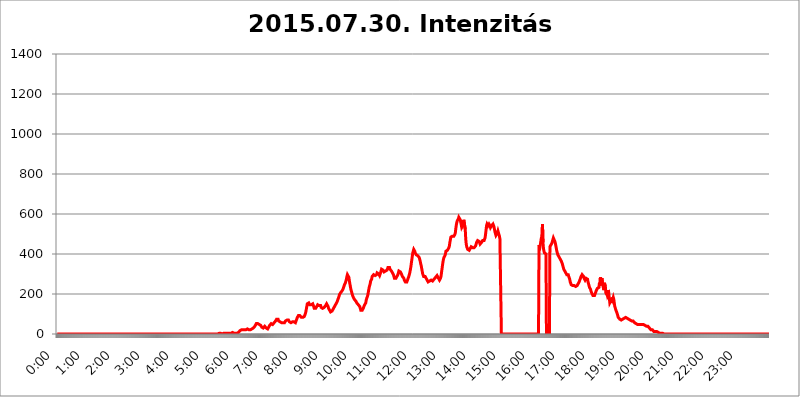
| Category | 2015.07.30. Intenzitás [W/m^2] |
|---|---|
| 0.0 | 0 |
| 0.0006944444444444445 | 0 |
| 0.001388888888888889 | 0 |
| 0.0020833333333333333 | 0 |
| 0.002777777777777778 | 0 |
| 0.003472222222222222 | 0 |
| 0.004166666666666667 | 0 |
| 0.004861111111111111 | 0 |
| 0.005555555555555556 | 0 |
| 0.0062499999999999995 | 0 |
| 0.006944444444444444 | 0 |
| 0.007638888888888889 | 0 |
| 0.008333333333333333 | 0 |
| 0.009027777777777779 | 0 |
| 0.009722222222222222 | 0 |
| 0.010416666666666666 | 0 |
| 0.011111111111111112 | 0 |
| 0.011805555555555555 | 0 |
| 0.012499999999999999 | 0 |
| 0.013194444444444444 | 0 |
| 0.013888888888888888 | 0 |
| 0.014583333333333332 | 0 |
| 0.015277777777777777 | 0 |
| 0.015972222222222224 | 0 |
| 0.016666666666666666 | 0 |
| 0.017361111111111112 | 0 |
| 0.018055555555555557 | 0 |
| 0.01875 | 0 |
| 0.019444444444444445 | 0 |
| 0.02013888888888889 | 0 |
| 0.020833333333333332 | 0 |
| 0.02152777777777778 | 0 |
| 0.022222222222222223 | 0 |
| 0.02291666666666667 | 0 |
| 0.02361111111111111 | 0 |
| 0.024305555555555556 | 0 |
| 0.024999999999999998 | 0 |
| 0.025694444444444447 | 0 |
| 0.02638888888888889 | 0 |
| 0.027083333333333334 | 0 |
| 0.027777777777777776 | 0 |
| 0.02847222222222222 | 0 |
| 0.029166666666666664 | 0 |
| 0.029861111111111113 | 0 |
| 0.030555555555555555 | 0 |
| 0.03125 | 0 |
| 0.03194444444444445 | 0 |
| 0.03263888888888889 | 0 |
| 0.03333333333333333 | 0 |
| 0.034027777777777775 | 0 |
| 0.034722222222222224 | 0 |
| 0.035416666666666666 | 0 |
| 0.036111111111111115 | 0 |
| 0.03680555555555556 | 0 |
| 0.0375 | 0 |
| 0.03819444444444444 | 0 |
| 0.03888888888888889 | 0 |
| 0.03958333333333333 | 0 |
| 0.04027777777777778 | 0 |
| 0.04097222222222222 | 0 |
| 0.041666666666666664 | 0 |
| 0.042361111111111106 | 0 |
| 0.04305555555555556 | 0 |
| 0.043750000000000004 | 0 |
| 0.044444444444444446 | 0 |
| 0.04513888888888889 | 0 |
| 0.04583333333333334 | 0 |
| 0.04652777777777778 | 0 |
| 0.04722222222222222 | 0 |
| 0.04791666666666666 | 0 |
| 0.04861111111111111 | 0 |
| 0.049305555555555554 | 0 |
| 0.049999999999999996 | 0 |
| 0.05069444444444445 | 0 |
| 0.051388888888888894 | 0 |
| 0.052083333333333336 | 0 |
| 0.05277777777777778 | 0 |
| 0.05347222222222222 | 0 |
| 0.05416666666666667 | 0 |
| 0.05486111111111111 | 0 |
| 0.05555555555555555 | 0 |
| 0.05625 | 0 |
| 0.05694444444444444 | 0 |
| 0.057638888888888885 | 0 |
| 0.05833333333333333 | 0 |
| 0.05902777777777778 | 0 |
| 0.059722222222222225 | 0 |
| 0.06041666666666667 | 0 |
| 0.061111111111111116 | 0 |
| 0.06180555555555556 | 0 |
| 0.0625 | 0 |
| 0.06319444444444444 | 0 |
| 0.06388888888888888 | 0 |
| 0.06458333333333334 | 0 |
| 0.06527777777777778 | 0 |
| 0.06597222222222222 | 0 |
| 0.06666666666666667 | 0 |
| 0.06736111111111111 | 0 |
| 0.06805555555555555 | 0 |
| 0.06874999999999999 | 0 |
| 0.06944444444444443 | 0 |
| 0.07013888888888889 | 0 |
| 0.07083333333333333 | 0 |
| 0.07152777777777779 | 0 |
| 0.07222222222222223 | 0 |
| 0.07291666666666667 | 0 |
| 0.07361111111111111 | 0 |
| 0.07430555555555556 | 0 |
| 0.075 | 0 |
| 0.07569444444444444 | 0 |
| 0.0763888888888889 | 0 |
| 0.07708333333333334 | 0 |
| 0.07777777777777778 | 0 |
| 0.07847222222222222 | 0 |
| 0.07916666666666666 | 0 |
| 0.0798611111111111 | 0 |
| 0.08055555555555556 | 0 |
| 0.08125 | 0 |
| 0.08194444444444444 | 0 |
| 0.08263888888888889 | 0 |
| 0.08333333333333333 | 0 |
| 0.08402777777777777 | 0 |
| 0.08472222222222221 | 0 |
| 0.08541666666666665 | 0 |
| 0.08611111111111112 | 0 |
| 0.08680555555555557 | 0 |
| 0.08750000000000001 | 0 |
| 0.08819444444444445 | 0 |
| 0.08888888888888889 | 0 |
| 0.08958333333333333 | 0 |
| 0.09027777777777778 | 0 |
| 0.09097222222222222 | 0 |
| 0.09166666666666667 | 0 |
| 0.09236111111111112 | 0 |
| 0.09305555555555556 | 0 |
| 0.09375 | 0 |
| 0.09444444444444444 | 0 |
| 0.09513888888888888 | 0 |
| 0.09583333333333333 | 0 |
| 0.09652777777777777 | 0 |
| 0.09722222222222222 | 0 |
| 0.09791666666666667 | 0 |
| 0.09861111111111111 | 0 |
| 0.09930555555555555 | 0 |
| 0.09999999999999999 | 0 |
| 0.10069444444444443 | 0 |
| 0.1013888888888889 | 0 |
| 0.10208333333333335 | 0 |
| 0.10277777777777779 | 0 |
| 0.10347222222222223 | 0 |
| 0.10416666666666667 | 0 |
| 0.10486111111111111 | 0 |
| 0.10555555555555556 | 0 |
| 0.10625 | 0 |
| 0.10694444444444444 | 0 |
| 0.1076388888888889 | 0 |
| 0.10833333333333334 | 0 |
| 0.10902777777777778 | 0 |
| 0.10972222222222222 | 0 |
| 0.1111111111111111 | 0 |
| 0.11180555555555556 | 0 |
| 0.11180555555555556 | 0 |
| 0.1125 | 0 |
| 0.11319444444444444 | 0 |
| 0.11388888888888889 | 0 |
| 0.11458333333333333 | 0 |
| 0.11527777777777777 | 0 |
| 0.11597222222222221 | 0 |
| 0.11666666666666665 | 0 |
| 0.1173611111111111 | 0 |
| 0.11805555555555557 | 0 |
| 0.11944444444444445 | 0 |
| 0.12013888888888889 | 0 |
| 0.12083333333333333 | 0 |
| 0.12152777777777778 | 0 |
| 0.12222222222222223 | 0 |
| 0.12291666666666667 | 0 |
| 0.12291666666666667 | 0 |
| 0.12361111111111112 | 0 |
| 0.12430555555555556 | 0 |
| 0.125 | 0 |
| 0.12569444444444444 | 0 |
| 0.12638888888888888 | 0 |
| 0.12708333333333333 | 0 |
| 0.16875 | 0 |
| 0.12847222222222224 | 0 |
| 0.12916666666666668 | 0 |
| 0.12986111111111112 | 0 |
| 0.13055555555555556 | 0 |
| 0.13125 | 0 |
| 0.13194444444444445 | 0 |
| 0.1326388888888889 | 0 |
| 0.13333333333333333 | 0 |
| 0.13402777777777777 | 0 |
| 0.13402777777777777 | 0 |
| 0.13472222222222222 | 0 |
| 0.13541666666666666 | 0 |
| 0.1361111111111111 | 0 |
| 0.13749999999999998 | 0 |
| 0.13819444444444443 | 0 |
| 0.1388888888888889 | 0 |
| 0.13958333333333334 | 0 |
| 0.14027777777777778 | 0 |
| 0.14097222222222222 | 0 |
| 0.14166666666666666 | 0 |
| 0.1423611111111111 | 0 |
| 0.14305555555555557 | 0 |
| 0.14375000000000002 | 0 |
| 0.14444444444444446 | 0 |
| 0.1451388888888889 | 0 |
| 0.1451388888888889 | 0 |
| 0.14652777777777778 | 0 |
| 0.14722222222222223 | 0 |
| 0.14791666666666667 | 0 |
| 0.1486111111111111 | 0 |
| 0.14930555555555555 | 0 |
| 0.15 | 0 |
| 0.15069444444444444 | 0 |
| 0.15138888888888888 | 0 |
| 0.15208333333333332 | 0 |
| 0.15277777777777776 | 0 |
| 0.15347222222222223 | 0 |
| 0.15416666666666667 | 0 |
| 0.15486111111111112 | 0 |
| 0.15555555555555556 | 0 |
| 0.15625 | 0 |
| 0.15694444444444444 | 0 |
| 0.15763888888888888 | 0 |
| 0.15833333333333333 | 0 |
| 0.15902777777777777 | 0 |
| 0.15972222222222224 | 0 |
| 0.16041666666666668 | 0 |
| 0.16111111111111112 | 0 |
| 0.16180555555555556 | 0 |
| 0.1625 | 0 |
| 0.16319444444444445 | 0 |
| 0.1638888888888889 | 0 |
| 0.16458333333333333 | 0 |
| 0.16527777777777777 | 0 |
| 0.16597222222222222 | 0 |
| 0.16666666666666666 | 0 |
| 0.1673611111111111 | 0 |
| 0.16805555555555554 | 0 |
| 0.16874999999999998 | 0 |
| 0.16944444444444443 | 0 |
| 0.17013888888888887 | 0 |
| 0.1708333333333333 | 0 |
| 0.17152777777777775 | 0 |
| 0.17222222222222225 | 0 |
| 0.1729166666666667 | 0 |
| 0.17361111111111113 | 0 |
| 0.17430555555555557 | 0 |
| 0.17500000000000002 | 0 |
| 0.17569444444444446 | 0 |
| 0.1763888888888889 | 0 |
| 0.17708333333333334 | 0 |
| 0.17777777777777778 | 0 |
| 0.17847222222222223 | 0 |
| 0.17916666666666667 | 0 |
| 0.1798611111111111 | 0 |
| 0.18055555555555555 | 0 |
| 0.18125 | 0 |
| 0.18194444444444444 | 0 |
| 0.1826388888888889 | 0 |
| 0.18333333333333335 | 0 |
| 0.1840277777777778 | 0 |
| 0.18472222222222223 | 0 |
| 0.18541666666666667 | 0 |
| 0.18611111111111112 | 0 |
| 0.18680555555555556 | 0 |
| 0.1875 | 0 |
| 0.18819444444444444 | 0 |
| 0.18888888888888888 | 0 |
| 0.18958333333333333 | 0 |
| 0.19027777777777777 | 0 |
| 0.1909722222222222 | 0 |
| 0.19166666666666665 | 0 |
| 0.19236111111111112 | 0 |
| 0.19305555555555554 | 0 |
| 0.19375 | 0 |
| 0.19444444444444445 | 0 |
| 0.1951388888888889 | 0 |
| 0.19583333333333333 | 0 |
| 0.19652777777777777 | 0 |
| 0.19722222222222222 | 0 |
| 0.19791666666666666 | 0 |
| 0.1986111111111111 | 0 |
| 0.19930555555555554 | 0 |
| 0.19999999999999998 | 0 |
| 0.20069444444444443 | 0 |
| 0.20138888888888887 | 0 |
| 0.2020833333333333 | 0 |
| 0.2027777777777778 | 0 |
| 0.2034722222222222 | 0 |
| 0.2041666666666667 | 0 |
| 0.20486111111111113 | 0 |
| 0.20555555555555557 | 0 |
| 0.20625000000000002 | 0 |
| 0.20694444444444446 | 0 |
| 0.2076388888888889 | 0 |
| 0.20833333333333334 | 0 |
| 0.20902777777777778 | 0 |
| 0.20972222222222223 | 0 |
| 0.21041666666666667 | 0 |
| 0.2111111111111111 | 0 |
| 0.21180555555555555 | 0 |
| 0.2125 | 0 |
| 0.21319444444444444 | 0 |
| 0.2138888888888889 | 0 |
| 0.21458333333333335 | 0 |
| 0.2152777777777778 | 0 |
| 0.21597222222222223 | 0 |
| 0.21666666666666667 | 0 |
| 0.21736111111111112 | 0 |
| 0.21805555555555556 | 0 |
| 0.21875 | 0 |
| 0.21944444444444444 | 0 |
| 0.22013888888888888 | 0 |
| 0.22083333333333333 | 0 |
| 0.22152777777777777 | 0 |
| 0.2222222222222222 | 0 |
| 0.22291666666666665 | 0 |
| 0.2236111111111111 | 0 |
| 0.22430555555555556 | 0 |
| 0.225 | 0 |
| 0.22569444444444445 | 0 |
| 0.2263888888888889 | 0 |
| 0.22708333333333333 | 3.525 |
| 0.22777777777777777 | 3.525 |
| 0.22847222222222222 | 3.525 |
| 0.22916666666666666 | 3.525 |
| 0.2298611111111111 | 3.525 |
| 0.23055555555555554 | 3.525 |
| 0.23124999999999998 | 0 |
| 0.23194444444444443 | 3.525 |
| 0.23263888888888887 | 3.525 |
| 0.2333333333333333 | 3.525 |
| 0.2340277777777778 | 3.525 |
| 0.2347222222222222 | 3.525 |
| 0.2354166666666667 | 3.525 |
| 0.23611111111111113 | 3.525 |
| 0.23680555555555557 | 3.525 |
| 0.23750000000000002 | 3.525 |
| 0.23819444444444446 | 3.525 |
| 0.2388888888888889 | 3.525 |
| 0.23958333333333334 | 3.525 |
| 0.24027777777777778 | 3.525 |
| 0.24097222222222223 | 3.525 |
| 0.24166666666666667 | 3.525 |
| 0.2423611111111111 | 3.525 |
| 0.24305555555555555 | 3.525 |
| 0.24375 | 3.525 |
| 0.24444444444444446 | 7.887 |
| 0.24513888888888888 | 7.887 |
| 0.24583333333333335 | 7.887 |
| 0.2465277777777778 | 7.887 |
| 0.24722222222222223 | 3.525 |
| 0.24791666666666667 | 3.525 |
| 0.24861111111111112 | 3.525 |
| 0.24930555555555556 | 3.525 |
| 0.25 | 3.525 |
| 0.25069444444444444 | 3.525 |
| 0.2513888888888889 | 3.525 |
| 0.2520833333333333 | 3.525 |
| 0.25277777777777777 | 3.525 |
| 0.2534722222222222 | 7.887 |
| 0.25416666666666665 | 7.887 |
| 0.2548611111111111 | 12.257 |
| 0.2555555555555556 | 12.257 |
| 0.25625000000000003 | 16.636 |
| 0.2569444444444445 | 16.636 |
| 0.2576388888888889 | 21.024 |
| 0.25833333333333336 | 21.024 |
| 0.2590277777777778 | 21.024 |
| 0.25972222222222224 | 21.024 |
| 0.2604166666666667 | 21.024 |
| 0.2611111111111111 | 21.024 |
| 0.26180555555555557 | 21.024 |
| 0.2625 | 21.024 |
| 0.26319444444444445 | 21.024 |
| 0.2638888888888889 | 21.024 |
| 0.26458333333333334 | 21.024 |
| 0.2652777777777778 | 21.024 |
| 0.2659722222222222 | 25.419 |
| 0.26666666666666666 | 25.419 |
| 0.2673611111111111 | 25.419 |
| 0.26805555555555555 | 25.419 |
| 0.26875 | 21.024 |
| 0.26944444444444443 | 21.024 |
| 0.2701388888888889 | 21.024 |
| 0.2708333333333333 | 21.024 |
| 0.27152777777777776 | 25.419 |
| 0.2722222222222222 | 25.419 |
| 0.27291666666666664 | 25.419 |
| 0.2736111111111111 | 29.823 |
| 0.2743055555555555 | 29.823 |
| 0.27499999999999997 | 29.823 |
| 0.27569444444444446 | 34.234 |
| 0.27638888888888885 | 34.234 |
| 0.27708333333333335 | 38.653 |
| 0.2777777777777778 | 43.079 |
| 0.27847222222222223 | 43.079 |
| 0.2791666666666667 | 51.951 |
| 0.2798611111111111 | 56.398 |
| 0.28055555555555556 | 56.398 |
| 0.28125 | 51.951 |
| 0.28194444444444444 | 51.951 |
| 0.2826388888888889 | 47.511 |
| 0.2833333333333333 | 47.511 |
| 0.28402777777777777 | 47.511 |
| 0.2847222222222222 | 43.079 |
| 0.28541666666666665 | 43.079 |
| 0.28611111111111115 | 38.653 |
| 0.28680555555555554 | 34.234 |
| 0.28750000000000003 | 29.823 |
| 0.2881944444444445 | 29.823 |
| 0.2888888888888889 | 29.823 |
| 0.28958333333333336 | 34.234 |
| 0.2902777777777778 | 34.234 |
| 0.29097222222222224 | 38.653 |
| 0.2916666666666667 | 34.234 |
| 0.2923611111111111 | 34.234 |
| 0.29305555555555557 | 29.823 |
| 0.29375 | 29.823 |
| 0.29444444444444445 | 25.419 |
| 0.2951388888888889 | 25.419 |
| 0.29583333333333334 | 29.823 |
| 0.2965277777777778 | 34.234 |
| 0.2972222222222222 | 38.653 |
| 0.29791666666666666 | 43.079 |
| 0.2986111111111111 | 47.511 |
| 0.29930555555555555 | 47.511 |
| 0.3 | 51.951 |
| 0.30069444444444443 | 47.511 |
| 0.3013888888888889 | 47.511 |
| 0.3020833333333333 | 47.511 |
| 0.30277777777777776 | 47.511 |
| 0.3034722222222222 | 47.511 |
| 0.30416666666666664 | 56.398 |
| 0.3048611111111111 | 56.398 |
| 0.3055555555555555 | 60.85 |
| 0.30624999999999997 | 65.31 |
| 0.3069444444444444 | 69.775 |
| 0.3076388888888889 | 74.246 |
| 0.30833333333333335 | 74.246 |
| 0.3090277777777778 | 74.246 |
| 0.30972222222222223 | 74.246 |
| 0.3104166666666667 | 65.31 |
| 0.3111111111111111 | 65.31 |
| 0.31180555555555556 | 60.85 |
| 0.3125 | 60.85 |
| 0.31319444444444444 | 56.398 |
| 0.3138888888888889 | 56.398 |
| 0.3145833333333333 | 56.398 |
| 0.31527777777777777 | 56.398 |
| 0.3159722222222222 | 56.398 |
| 0.31666666666666665 | 56.398 |
| 0.31736111111111115 | 56.398 |
| 0.31805555555555554 | 56.398 |
| 0.31875000000000003 | 56.398 |
| 0.3194444444444445 | 60.85 |
| 0.3201388888888889 | 65.31 |
| 0.32083333333333336 | 65.31 |
| 0.3215277777777778 | 69.775 |
| 0.32222222222222224 | 69.775 |
| 0.3229166666666667 | 69.775 |
| 0.3236111111111111 | 69.775 |
| 0.32430555555555557 | 69.775 |
| 0.325 | 65.31 |
| 0.32569444444444445 | 60.85 |
| 0.3263888888888889 | 56.398 |
| 0.32708333333333334 | 56.398 |
| 0.3277777777777778 | 56.398 |
| 0.3284722222222222 | 56.398 |
| 0.32916666666666666 | 60.85 |
| 0.3298611111111111 | 60.85 |
| 0.33055555555555555 | 60.85 |
| 0.33125 | 60.85 |
| 0.33194444444444443 | 60.85 |
| 0.3326388888888889 | 56.398 |
| 0.3333333333333333 | 56.398 |
| 0.3340277777777778 | 56.398 |
| 0.3347222222222222 | 60.85 |
| 0.3354166666666667 | 69.775 |
| 0.3361111111111111 | 74.246 |
| 0.3368055555555556 | 83.205 |
| 0.33749999999999997 | 87.692 |
| 0.33819444444444446 | 92.184 |
| 0.33888888888888885 | 96.682 |
| 0.33958333333333335 | 92.184 |
| 0.34027777777777773 | 92.184 |
| 0.34097222222222223 | 87.692 |
| 0.3416666666666666 | 87.692 |
| 0.3423611111111111 | 83.205 |
| 0.3430555555555555 | 83.205 |
| 0.34375 | 83.205 |
| 0.3444444444444445 | 83.205 |
| 0.3451388888888889 | 83.205 |
| 0.3458333333333334 | 83.205 |
| 0.34652777777777777 | 87.692 |
| 0.34722222222222227 | 92.184 |
| 0.34791666666666665 | 101.184 |
| 0.34861111111111115 | 110.201 |
| 0.34930555555555554 | 123.758 |
| 0.35000000000000003 | 137.347 |
| 0.3506944444444444 | 150.964 |
| 0.3513888888888889 | 155.509 |
| 0.3520833333333333 | 155.509 |
| 0.3527777777777778 | 155.509 |
| 0.3534722222222222 | 150.964 |
| 0.3541666666666667 | 146.423 |
| 0.3548611111111111 | 141.884 |
| 0.35555555555555557 | 146.423 |
| 0.35625 | 146.423 |
| 0.35694444444444445 | 150.964 |
| 0.3576388888888889 | 150.964 |
| 0.35833333333333334 | 150.964 |
| 0.3590277777777778 | 146.423 |
| 0.3597222222222222 | 137.347 |
| 0.36041666666666666 | 128.284 |
| 0.3611111111111111 | 128.284 |
| 0.36180555555555555 | 128.284 |
| 0.3625 | 128.284 |
| 0.36319444444444443 | 132.814 |
| 0.3638888888888889 | 137.347 |
| 0.3645833333333333 | 137.347 |
| 0.3652777777777778 | 146.423 |
| 0.3659722222222222 | 146.423 |
| 0.3666666666666667 | 146.423 |
| 0.3673611111111111 | 141.884 |
| 0.3680555555555556 | 141.884 |
| 0.36874999999999997 | 146.423 |
| 0.36944444444444446 | 141.884 |
| 0.37013888888888885 | 132.814 |
| 0.37083333333333335 | 128.284 |
| 0.37152777777777773 | 128.284 |
| 0.37222222222222223 | 128.284 |
| 0.3729166666666666 | 128.284 |
| 0.3736111111111111 | 128.284 |
| 0.3743055555555555 | 132.814 |
| 0.375 | 132.814 |
| 0.3756944444444445 | 137.347 |
| 0.3763888888888889 | 141.884 |
| 0.3770833333333334 | 146.423 |
| 0.37777777777777777 | 150.964 |
| 0.37847222222222227 | 150.964 |
| 0.37916666666666665 | 146.423 |
| 0.37986111111111115 | 137.347 |
| 0.38055555555555554 | 128.284 |
| 0.38125000000000003 | 123.758 |
| 0.3819444444444444 | 119.235 |
| 0.3826388888888889 | 119.235 |
| 0.3833333333333333 | 110.201 |
| 0.3840277777777778 | 110.201 |
| 0.3847222222222222 | 110.201 |
| 0.3854166666666667 | 114.716 |
| 0.3861111111111111 | 119.235 |
| 0.38680555555555557 | 123.758 |
| 0.3875 | 123.758 |
| 0.38819444444444445 | 132.814 |
| 0.3888888888888889 | 137.347 |
| 0.38958333333333334 | 141.884 |
| 0.3902777777777778 | 146.423 |
| 0.3909722222222222 | 150.964 |
| 0.39166666666666666 | 155.509 |
| 0.3923611111111111 | 160.056 |
| 0.39305555555555555 | 164.605 |
| 0.39375 | 173.709 |
| 0.39444444444444443 | 178.264 |
| 0.3951388888888889 | 187.378 |
| 0.3958333333333333 | 196.497 |
| 0.3965277777777778 | 201.058 |
| 0.3972222222222222 | 205.62 |
| 0.3979166666666667 | 205.62 |
| 0.3986111111111111 | 210.182 |
| 0.3993055555555556 | 214.746 |
| 0.39999999999999997 | 214.746 |
| 0.40069444444444446 | 223.873 |
| 0.40138888888888885 | 228.436 |
| 0.40208333333333335 | 237.564 |
| 0.40277777777777773 | 246.689 |
| 0.40347222222222223 | 251.251 |
| 0.4041666666666666 | 255.813 |
| 0.4048611111111111 | 264.932 |
| 0.4055555555555555 | 274.047 |
| 0.40625 | 287.709 |
| 0.4069444444444445 | 296.808 |
| 0.4076388888888889 | 296.808 |
| 0.4083333333333334 | 296.808 |
| 0.40902777777777777 | 283.156 |
| 0.40972222222222227 | 264.932 |
| 0.41041666666666665 | 251.251 |
| 0.41111111111111115 | 237.564 |
| 0.41180555555555554 | 223.873 |
| 0.41250000000000003 | 214.746 |
| 0.4131944444444444 | 205.62 |
| 0.4138888888888889 | 196.497 |
| 0.4145833333333333 | 191.937 |
| 0.4152777777777778 | 182.82 |
| 0.4159722222222222 | 178.264 |
| 0.4166666666666667 | 173.709 |
| 0.4173611111111111 | 173.709 |
| 0.41805555555555557 | 169.156 |
| 0.41875 | 164.605 |
| 0.41944444444444445 | 160.056 |
| 0.4201388888888889 | 155.509 |
| 0.42083333333333334 | 155.509 |
| 0.4215277777777778 | 150.964 |
| 0.4222222222222222 | 146.423 |
| 0.42291666666666666 | 141.884 |
| 0.4236111111111111 | 141.884 |
| 0.42430555555555555 | 137.347 |
| 0.425 | 128.284 |
| 0.42569444444444443 | 119.235 |
| 0.4263888888888889 | 114.716 |
| 0.4270833333333333 | 114.716 |
| 0.4277777777777778 | 119.235 |
| 0.4284722222222222 | 123.758 |
| 0.4291666666666667 | 128.284 |
| 0.4298611111111111 | 132.814 |
| 0.4305555555555556 | 141.884 |
| 0.43124999999999997 | 146.423 |
| 0.43194444444444446 | 146.423 |
| 0.43263888888888885 | 155.509 |
| 0.43333333333333335 | 169.156 |
| 0.43402777777777773 | 178.264 |
| 0.43472222222222223 | 182.82 |
| 0.4354166666666666 | 191.937 |
| 0.4361111111111111 | 205.62 |
| 0.4368055555555555 | 219.309 |
| 0.4375 | 233 |
| 0.4381944444444445 | 242.127 |
| 0.4388888888888889 | 251.251 |
| 0.4395833333333334 | 264.932 |
| 0.44027777777777777 | 269.49 |
| 0.44097222222222227 | 274.047 |
| 0.44166666666666665 | 287.709 |
| 0.44236111111111115 | 287.709 |
| 0.44305555555555554 | 287.709 |
| 0.44375000000000003 | 296.808 |
| 0.4444444444444444 | 296.808 |
| 0.4451388888888889 | 292.259 |
| 0.4458333333333333 | 292.259 |
| 0.4465277777777778 | 292.259 |
| 0.4472222222222222 | 292.259 |
| 0.4479166666666667 | 296.808 |
| 0.4486111111111111 | 305.898 |
| 0.44930555555555557 | 305.898 |
| 0.45 | 305.898 |
| 0.45069444444444445 | 301.354 |
| 0.4513888888888889 | 296.808 |
| 0.45208333333333334 | 292.259 |
| 0.4527777777777778 | 296.808 |
| 0.4534722222222222 | 305.898 |
| 0.45416666666666666 | 314.98 |
| 0.4548611111111111 | 324.052 |
| 0.45555555555555555 | 324.052 |
| 0.45625 | 324.052 |
| 0.45694444444444443 | 319.517 |
| 0.4576388888888889 | 314.98 |
| 0.4583333333333333 | 310.44 |
| 0.4590277777777778 | 310.44 |
| 0.4597222222222222 | 314.98 |
| 0.4604166666666667 | 314.98 |
| 0.4611111111111111 | 314.98 |
| 0.4618055555555556 | 314.98 |
| 0.46249999999999997 | 319.517 |
| 0.46319444444444446 | 324.052 |
| 0.46388888888888885 | 333.113 |
| 0.46458333333333335 | 333.113 |
| 0.46527777777777773 | 337.639 |
| 0.46597222222222223 | 333.113 |
| 0.4666666666666666 | 324.052 |
| 0.4673611111111111 | 319.517 |
| 0.4680555555555555 | 319.517 |
| 0.46875 | 314.98 |
| 0.4694444444444445 | 310.44 |
| 0.4701388888888889 | 305.898 |
| 0.4708333333333334 | 301.354 |
| 0.47152777777777777 | 296.808 |
| 0.47222222222222227 | 287.709 |
| 0.47291666666666665 | 278.603 |
| 0.47361111111111115 | 278.603 |
| 0.47430555555555554 | 278.603 |
| 0.47500000000000003 | 278.603 |
| 0.4756944444444444 | 283.156 |
| 0.4763888888888889 | 287.709 |
| 0.4770833333333333 | 292.259 |
| 0.4777777777777778 | 296.808 |
| 0.4784722222222222 | 305.898 |
| 0.4791666666666667 | 314.98 |
| 0.4798611111111111 | 314.98 |
| 0.48055555555555557 | 314.98 |
| 0.48125 | 310.44 |
| 0.48194444444444445 | 305.898 |
| 0.4826388888888889 | 301.354 |
| 0.48333333333333334 | 296.808 |
| 0.4840277777777778 | 287.709 |
| 0.4847222222222222 | 287.709 |
| 0.48541666666666666 | 283.156 |
| 0.4861111111111111 | 278.603 |
| 0.48680555555555555 | 269.49 |
| 0.4875 | 264.932 |
| 0.48819444444444443 | 260.373 |
| 0.4888888888888889 | 255.813 |
| 0.4895833333333333 | 255.813 |
| 0.4902777777777778 | 260.373 |
| 0.4909722222222222 | 264.932 |
| 0.4916666666666667 | 274.047 |
| 0.4923611111111111 | 278.603 |
| 0.4930555555555556 | 287.709 |
| 0.49374999999999997 | 296.808 |
| 0.49444444444444446 | 305.898 |
| 0.49513888888888885 | 319.517 |
| 0.49583333333333335 | 333.113 |
| 0.49652777777777773 | 351.198 |
| 0.49722222222222223 | 369.23 |
| 0.4979166666666666 | 387.202 |
| 0.4986111111111111 | 405.108 |
| 0.4993055555555555 | 414.035 |
| 0.5 | 422.943 |
| 0.5006944444444444 | 422.943 |
| 0.5013888888888889 | 414.035 |
| 0.5020833333333333 | 405.108 |
| 0.5027777777777778 | 400.638 |
| 0.5034722222222222 | 396.164 |
| 0.5041666666666667 | 396.164 |
| 0.5048611111111111 | 396.164 |
| 0.5055555555555555 | 391.685 |
| 0.50625 | 391.685 |
| 0.5069444444444444 | 387.202 |
| 0.5076388888888889 | 382.715 |
| 0.5083333333333333 | 373.729 |
| 0.5090277777777777 | 364.728 |
| 0.5097222222222222 | 351.198 |
| 0.5104166666666666 | 342.162 |
| 0.5111111111111112 | 328.584 |
| 0.5118055555555555 | 314.98 |
| 0.5125000000000001 | 301.354 |
| 0.5131944444444444 | 296.808 |
| 0.513888888888889 | 287.709 |
| 0.5145833333333333 | 287.709 |
| 0.5152777777777778 | 287.709 |
| 0.5159722222222222 | 287.709 |
| 0.5166666666666667 | 283.156 |
| 0.517361111111111 | 278.603 |
| 0.5180555555555556 | 274.047 |
| 0.5187499999999999 | 269.49 |
| 0.5194444444444445 | 264.932 |
| 0.5201388888888888 | 260.373 |
| 0.5208333333333334 | 260.373 |
| 0.5215277777777778 | 264.932 |
| 0.5222222222222223 | 264.932 |
| 0.5229166666666667 | 269.49 |
| 0.5236111111111111 | 269.49 |
| 0.5243055555555556 | 269.49 |
| 0.525 | 269.49 |
| 0.5256944444444445 | 264.932 |
| 0.5263888888888889 | 264.932 |
| 0.5270833333333333 | 264.932 |
| 0.5277777777777778 | 269.49 |
| 0.5284722222222222 | 274.047 |
| 0.5291666666666667 | 278.603 |
| 0.5298611111111111 | 278.603 |
| 0.5305555555555556 | 283.156 |
| 0.53125 | 287.709 |
| 0.5319444444444444 | 287.709 |
| 0.5326388888888889 | 292.259 |
| 0.5333333333333333 | 292.259 |
| 0.5340277777777778 | 287.709 |
| 0.5347222222222222 | 278.603 |
| 0.5354166666666667 | 274.047 |
| 0.5361111111111111 | 269.49 |
| 0.5368055555555555 | 269.49 |
| 0.5375 | 278.603 |
| 0.5381944444444444 | 287.709 |
| 0.5388888888888889 | 305.898 |
| 0.5395833333333333 | 324.052 |
| 0.5402777777777777 | 342.162 |
| 0.5409722222222222 | 360.221 |
| 0.5416666666666666 | 373.729 |
| 0.5423611111111112 | 382.715 |
| 0.5430555555555555 | 387.202 |
| 0.5437500000000001 | 391.685 |
| 0.5444444444444444 | 400.638 |
| 0.545138888888889 | 414.035 |
| 0.5458333333333333 | 418.492 |
| 0.5465277777777778 | 418.492 |
| 0.5472222222222222 | 418.492 |
| 0.5479166666666667 | 418.492 |
| 0.548611111111111 | 422.943 |
| 0.5493055555555556 | 431.833 |
| 0.5499999999999999 | 440.702 |
| 0.5506944444444445 | 458.38 |
| 0.5513888888888888 | 471.582 |
| 0.5520833333333334 | 484.735 |
| 0.5527777777777778 | 489.108 |
| 0.5534722222222223 | 489.108 |
| 0.5541666666666667 | 489.108 |
| 0.5548611111111111 | 489.108 |
| 0.5555555555555556 | 489.108 |
| 0.55625 | 489.108 |
| 0.5569444444444445 | 489.108 |
| 0.5576388888888889 | 497.836 |
| 0.5583333333333333 | 506.542 |
| 0.5590277777777778 | 528.2 |
| 0.5597222222222222 | 545.416 |
| 0.5604166666666667 | 558.261 |
| 0.5611111111111111 | 566.793 |
| 0.5618055555555556 | 566.793 |
| 0.5625 | 575.299 |
| 0.5631944444444444 | 583.779 |
| 0.5638888888888889 | 588.009 |
| 0.5645833333333333 | 583.779 |
| 0.5652777777777778 | 571.049 |
| 0.5659722222222222 | 558.261 |
| 0.5666666666666667 | 545.416 |
| 0.5673611111111111 | 532.513 |
| 0.5680555555555555 | 532.513 |
| 0.56875 | 541.121 |
| 0.5694444444444444 | 553.986 |
| 0.5701388888888889 | 571.049 |
| 0.5708333333333333 | 575.299 |
| 0.5715277777777777 | 566.793 |
| 0.5722222222222222 | 523.88 |
| 0.5729166666666666 | 475.972 |
| 0.5736111111111112 | 449.551 |
| 0.5743055555555555 | 436.27 |
| 0.5750000000000001 | 431.833 |
| 0.5756944444444444 | 422.943 |
| 0.576388888888889 | 418.492 |
| 0.5770833333333333 | 418.492 |
| 0.5777777777777778 | 418.492 |
| 0.5784722222222222 | 422.943 |
| 0.5791666666666667 | 427.39 |
| 0.579861111111111 | 431.833 |
| 0.5805555555555556 | 436.27 |
| 0.5812499999999999 | 436.27 |
| 0.5819444444444445 | 436.27 |
| 0.5826388888888888 | 431.833 |
| 0.5833333333333334 | 431.833 |
| 0.5840277777777778 | 431.833 |
| 0.5847222222222223 | 431.833 |
| 0.5854166666666667 | 431.833 |
| 0.5861111111111111 | 436.27 |
| 0.5868055555555556 | 440.702 |
| 0.5875 | 449.551 |
| 0.5881944444444445 | 458.38 |
| 0.5888888888888889 | 462.786 |
| 0.5895833333333333 | 467.187 |
| 0.5902777777777778 | 467.187 |
| 0.5909722222222222 | 467.187 |
| 0.5916666666666667 | 462.786 |
| 0.5923611111111111 | 458.38 |
| 0.5930555555555556 | 449.551 |
| 0.59375 | 449.551 |
| 0.5944444444444444 | 449.551 |
| 0.5951388888888889 | 458.38 |
| 0.5958333333333333 | 462.786 |
| 0.5965277777777778 | 467.187 |
| 0.5972222222222222 | 467.187 |
| 0.5979166666666667 | 467.187 |
| 0.5986111111111111 | 467.187 |
| 0.5993055555555555 | 471.582 |
| 0.6 | 480.356 |
| 0.6006944444444444 | 497.836 |
| 0.6013888888888889 | 519.555 |
| 0.6020833333333333 | 541.121 |
| 0.6027777777777777 | 549.704 |
| 0.6034722222222222 | 545.416 |
| 0.6041666666666666 | 541.121 |
| 0.6048611111111112 | 541.121 |
| 0.6055555555555555 | 549.704 |
| 0.6062500000000001 | 549.704 |
| 0.6069444444444444 | 541.121 |
| 0.607638888888889 | 532.513 |
| 0.6083333333333333 | 532.513 |
| 0.6090277777777778 | 541.121 |
| 0.6097222222222222 | 541.121 |
| 0.6104166666666667 | 545.416 |
| 0.611111111111111 | 549.704 |
| 0.6118055555555556 | 545.416 |
| 0.6124999999999999 | 536.82 |
| 0.6131944444444445 | 523.88 |
| 0.6138888888888888 | 510.885 |
| 0.6145833333333334 | 502.192 |
| 0.6152777777777778 | 493.475 |
| 0.6159722222222223 | 493.475 |
| 0.6166666666666667 | 497.836 |
| 0.6173611111111111 | 506.542 |
| 0.6180555555555556 | 515.223 |
| 0.61875 | 510.885 |
| 0.6194444444444445 | 497.836 |
| 0.6201388888888889 | 489.108 |
| 0.6208333333333333 | 475.972 |
| 0.6215277777777778 | 471.582 |
| 0.6222222222222222 | 471.582 |
| 0.6229166666666667 | 0 |
| 0.6236111111111111 | 0 |
| 0.6243055555555556 | 0 |
| 0.625 | 0 |
| 0.6256944444444444 | 0 |
| 0.6263888888888889 | 0 |
| 0.6270833333333333 | 0 |
| 0.6277777777777778 | 0 |
| 0.6284722222222222 | 0 |
| 0.6291666666666667 | 0 |
| 0.6298611111111111 | 0 |
| 0.6305555555555555 | 0 |
| 0.63125 | 0 |
| 0.6319444444444444 | 0 |
| 0.6326388888888889 | 0 |
| 0.6333333333333333 | 0 |
| 0.6340277777777777 | 0 |
| 0.6347222222222222 | 0 |
| 0.6354166666666666 | 0 |
| 0.6361111111111112 | 0 |
| 0.6368055555555555 | 0 |
| 0.6375000000000001 | 0 |
| 0.6381944444444444 | 0 |
| 0.638888888888889 | 0 |
| 0.6395833333333333 | 0 |
| 0.6402777777777778 | 0 |
| 0.6409722222222222 | 0 |
| 0.6416666666666667 | 0 |
| 0.642361111111111 | 0 |
| 0.6430555555555556 | 0 |
| 0.6437499999999999 | 0 |
| 0.6444444444444445 | 0 |
| 0.6451388888888888 | 0 |
| 0.6458333333333334 | 0 |
| 0.6465277777777778 | 0 |
| 0.6472222222222223 | 0 |
| 0.6479166666666667 | 0 |
| 0.6486111111111111 | 0 |
| 0.6493055555555556 | 0 |
| 0.65 | 0 |
| 0.6506944444444445 | 0 |
| 0.6513888888888889 | 0 |
| 0.6520833333333333 | 0 |
| 0.6527777777777778 | 0 |
| 0.6534722222222222 | 0 |
| 0.6541666666666667 | 0 |
| 0.6548611111111111 | 0 |
| 0.6555555555555556 | 0 |
| 0.65625 | 0 |
| 0.6569444444444444 | 0 |
| 0.6576388888888889 | 0 |
| 0.6583333333333333 | 0 |
| 0.6590277777777778 | 0 |
| 0.6597222222222222 | 0 |
| 0.6604166666666667 | 0 |
| 0.6611111111111111 | 0 |
| 0.6618055555555555 | 0 |
| 0.6625 | 0 |
| 0.6631944444444444 | 0 |
| 0.6638888888888889 | 0 |
| 0.6645833333333333 | 0 |
| 0.6652777777777777 | 0 |
| 0.6659722222222222 | 0 |
| 0.6666666666666666 | 0 |
| 0.6673611111111111 | 0 |
| 0.6680555555555556 | 0 |
| 0.6687500000000001 | 0 |
| 0.6694444444444444 | 0 |
| 0.6701388888888888 | 0 |
| 0.6708333333333334 | 0 |
| 0.6715277777777778 | 0 |
| 0.6722222222222222 | 0 |
| 0.6729166666666666 | 0 |
| 0.6736111111111112 | 0 |
| 0.6743055555555556 | 0 |
| 0.6749999999999999 | 0 |
| 0.6756944444444444 | 445.129 |
| 0.6763888888888889 | 440.702 |
| 0.6770833333333334 | 436.27 |
| 0.6777777777777777 | 431.833 |
| 0.6784722222222223 | 440.702 |
| 0.6791666666666667 | 484.735 |
| 0.6798611111111111 | 475.972 |
| 0.6805555555555555 | 549.704 |
| 0.68125 | 458.38 |
| 0.6819444444444445 | 427.39 |
| 0.6826388888888889 | 414.035 |
| 0.6833333333333332 | 405.108 |
| 0.6840277777777778 | 405.108 |
| 0.6847222222222222 | 405.108 |
| 0.6854166666666667 | 400.638 |
| 0.686111111111111 | 0 |
| 0.6868055555555556 | 0 |
| 0.6875 | 0 |
| 0.6881944444444444 | 0 |
| 0.688888888888889 | 0 |
| 0.6895833333333333 | 0 |
| 0.6902777777777778 | 0 |
| 0.6909722222222222 | 436.27 |
| 0.6916666666666668 | 440.702 |
| 0.6923611111111111 | 445.129 |
| 0.6930555555555555 | 445.129 |
| 0.69375 | 453.968 |
| 0.6944444444444445 | 462.786 |
| 0.6951388888888889 | 471.582 |
| 0.6958333333333333 | 480.356 |
| 0.6965277777777777 | 480.356 |
| 0.6972222222222223 | 475.972 |
| 0.6979166666666666 | 462.786 |
| 0.6986111111111111 | 453.968 |
| 0.6993055555555556 | 440.702 |
| 0.7000000000000001 | 427.39 |
| 0.7006944444444444 | 414.035 |
| 0.7013888888888888 | 405.108 |
| 0.7020833333333334 | 396.164 |
| 0.7027777777777778 | 391.685 |
| 0.7034722222222222 | 387.202 |
| 0.7041666666666666 | 382.715 |
| 0.7048611111111112 | 378.224 |
| 0.7055555555555556 | 373.729 |
| 0.7062499999999999 | 373.729 |
| 0.7069444444444444 | 364.728 |
| 0.7076388888888889 | 360.221 |
| 0.7083333333333334 | 351.198 |
| 0.7090277777777777 | 342.162 |
| 0.7097222222222223 | 333.113 |
| 0.7104166666666667 | 324.052 |
| 0.7111111111111111 | 319.517 |
| 0.7118055555555555 | 314.98 |
| 0.7125 | 314.98 |
| 0.7131944444444445 | 305.898 |
| 0.7138888888888889 | 301.354 |
| 0.7145833333333332 | 296.808 |
| 0.7152777777777778 | 296.808 |
| 0.7159722222222222 | 296.808 |
| 0.7166666666666667 | 296.808 |
| 0.717361111111111 | 287.709 |
| 0.7180555555555556 | 283.156 |
| 0.71875 | 274.047 |
| 0.7194444444444444 | 260.373 |
| 0.720138888888889 | 255.813 |
| 0.7208333333333333 | 246.689 |
| 0.7215277777777778 | 246.689 |
| 0.7222222222222222 | 242.127 |
| 0.7229166666666668 | 242.127 |
| 0.7236111111111111 | 242.127 |
| 0.7243055555555555 | 242.127 |
| 0.725 | 242.127 |
| 0.7256944444444445 | 237.564 |
| 0.7263888888888889 | 237.564 |
| 0.7270833333333333 | 237.564 |
| 0.7277777777777777 | 237.564 |
| 0.7284722222222223 | 237.564 |
| 0.7291666666666666 | 242.127 |
| 0.7298611111111111 | 242.127 |
| 0.7305555555555556 | 251.251 |
| 0.7312500000000001 | 255.813 |
| 0.7319444444444444 | 260.373 |
| 0.7326388888888888 | 264.932 |
| 0.7333333333333334 | 274.047 |
| 0.7340277777777778 | 278.603 |
| 0.7347222222222222 | 287.709 |
| 0.7354166666666666 | 292.259 |
| 0.7361111111111112 | 296.808 |
| 0.7368055555555556 | 296.808 |
| 0.7374999999999999 | 292.259 |
| 0.7381944444444444 | 287.709 |
| 0.7388888888888889 | 278.603 |
| 0.7395833333333334 | 278.603 |
| 0.7402777777777777 | 269.49 |
| 0.7409722222222223 | 274.047 |
| 0.7416666666666667 | 278.603 |
| 0.7423611111111111 | 283.156 |
| 0.7430555555555555 | 283.156 |
| 0.74375 | 274.047 |
| 0.7444444444444445 | 260.373 |
| 0.7451388888888889 | 251.251 |
| 0.7458333333333332 | 242.127 |
| 0.7465277777777778 | 233 |
| 0.7472222222222222 | 228.436 |
| 0.7479166666666667 | 223.873 |
| 0.748611111111111 | 214.746 |
| 0.7493055555555556 | 210.182 |
| 0.75 | 201.058 |
| 0.7506944444444444 | 196.497 |
| 0.751388888888889 | 191.937 |
| 0.7520833333333333 | 191.937 |
| 0.7527777777777778 | 187.378 |
| 0.7534722222222222 | 191.937 |
| 0.7541666666666668 | 196.497 |
| 0.7548611111111111 | 205.62 |
| 0.7555555555555555 | 210.182 |
| 0.75625 | 219.309 |
| 0.7569444444444445 | 223.873 |
| 0.7576388888888889 | 228.436 |
| 0.7583333333333333 | 228.436 |
| 0.7590277777777777 | 233 |
| 0.7597222222222223 | 233 |
| 0.7604166666666666 | 255.813 |
| 0.7611111111111111 | 242.127 |
| 0.7618055555555556 | 283.156 |
| 0.7625000000000001 | 287.709 |
| 0.7631944444444444 | 269.49 |
| 0.7638888888888888 | 278.603 |
| 0.7645833333333334 | 278.603 |
| 0.7652777777777778 | 242.127 |
| 0.7659722222222222 | 246.689 |
| 0.7666666666666666 | 219.309 |
| 0.7673611111111112 | 255.813 |
| 0.7680555555555556 | 251.251 |
| 0.7687499999999999 | 237.564 |
| 0.7694444444444444 | 205.62 |
| 0.7701388888888889 | 201.058 |
| 0.7708333333333334 | 196.497 |
| 0.7715277777777777 | 219.309 |
| 0.7722222222222223 | 191.937 |
| 0.7729166666666667 | 191.937 |
| 0.7736111111111111 | 201.058 |
| 0.7743055555555555 | 178.264 |
| 0.775 | 155.509 |
| 0.7756944444444445 | 155.509 |
| 0.7763888888888889 | 164.605 |
| 0.7770833333333332 | 155.509 |
| 0.7777777777777778 | 169.156 |
| 0.7784722222222222 | 182.82 |
| 0.7791666666666667 | 173.709 |
| 0.779861111111111 | 182.82 |
| 0.7805555555555556 | 173.709 |
| 0.78125 | 173.709 |
| 0.7819444444444444 | 137.347 |
| 0.782638888888889 | 132.814 |
| 0.7833333333333333 | 132.814 |
| 0.7840277777777778 | 114.716 |
| 0.7847222222222222 | 110.201 |
| 0.7854166666666668 | 101.184 |
| 0.7861111111111111 | 92.184 |
| 0.7868055555555555 | 83.205 |
| 0.7875 | 78.722 |
| 0.7881944444444445 | 78.722 |
| 0.7888888888888889 | 74.246 |
| 0.7895833333333333 | 74.246 |
| 0.7902777777777777 | 69.775 |
| 0.7909722222222223 | 69.775 |
| 0.7916666666666666 | 69.775 |
| 0.7923611111111111 | 69.775 |
| 0.7930555555555556 | 74.246 |
| 0.7937500000000001 | 74.246 |
| 0.7944444444444444 | 78.722 |
| 0.7951388888888888 | 78.722 |
| 0.7958333333333334 | 83.205 |
| 0.7965277777777778 | 83.205 |
| 0.7972222222222222 | 83.205 |
| 0.7979166666666666 | 83.205 |
| 0.7986111111111112 | 78.722 |
| 0.7993055555555556 | 78.722 |
| 0.7999999999999999 | 74.246 |
| 0.8006944444444444 | 74.246 |
| 0.8013888888888889 | 74.246 |
| 0.8020833333333334 | 74.246 |
| 0.8027777777777777 | 74.246 |
| 0.8034722222222223 | 69.775 |
| 0.8041666666666667 | 69.775 |
| 0.8048611111111111 | 69.775 |
| 0.8055555555555555 | 65.31 |
| 0.80625 | 65.31 |
| 0.8069444444444445 | 65.31 |
| 0.8076388888888889 | 65.31 |
| 0.8083333333333332 | 60.85 |
| 0.8090277777777778 | 60.85 |
| 0.8097222222222222 | 56.398 |
| 0.8104166666666667 | 51.951 |
| 0.811111111111111 | 51.951 |
| 0.8118055555555556 | 51.951 |
| 0.8125 | 51.951 |
| 0.8131944444444444 | 51.951 |
| 0.813888888888889 | 47.511 |
| 0.8145833333333333 | 47.511 |
| 0.8152777777777778 | 47.511 |
| 0.8159722222222222 | 47.511 |
| 0.8166666666666668 | 47.511 |
| 0.8173611111111111 | 47.511 |
| 0.8180555555555555 | 47.511 |
| 0.81875 | 47.511 |
| 0.8194444444444445 | 47.511 |
| 0.8201388888888889 | 47.511 |
| 0.8208333333333333 | 47.511 |
| 0.8215277777777777 | 47.511 |
| 0.8222222222222223 | 47.511 |
| 0.8229166666666666 | 47.511 |
| 0.8236111111111111 | 47.511 |
| 0.8243055555555556 | 43.079 |
| 0.8250000000000001 | 43.079 |
| 0.8256944444444444 | 43.079 |
| 0.8263888888888888 | 38.653 |
| 0.8270833333333334 | 38.653 |
| 0.8277777777777778 | 38.653 |
| 0.8284722222222222 | 38.653 |
| 0.8291666666666666 | 34.234 |
| 0.8298611111111112 | 34.234 |
| 0.8305555555555556 | 29.823 |
| 0.8312499999999999 | 29.823 |
| 0.8319444444444444 | 25.419 |
| 0.8326388888888889 | 21.024 |
| 0.8333333333333334 | 21.024 |
| 0.8340277777777777 | 21.024 |
| 0.8347222222222223 | 21.024 |
| 0.8354166666666667 | 21.024 |
| 0.8361111111111111 | 16.636 |
| 0.8368055555555555 | 12.257 |
| 0.8375 | 16.636 |
| 0.8381944444444445 | 12.257 |
| 0.8388888888888889 | 12.257 |
| 0.8395833333333332 | 12.257 |
| 0.8402777777777778 | 12.257 |
| 0.8409722222222222 | 12.257 |
| 0.8416666666666667 | 7.887 |
| 0.842361111111111 | 7.887 |
| 0.8430555555555556 | 7.887 |
| 0.84375 | 7.887 |
| 0.8444444444444444 | 3.525 |
| 0.845138888888889 | 3.525 |
| 0.8458333333333333 | 3.525 |
| 0.8465277777777778 | 3.525 |
| 0.8472222222222222 | 3.525 |
| 0.8479166666666668 | 3.525 |
| 0.8486111111111111 | 3.525 |
| 0.8493055555555555 | 3.525 |
| 0.85 | 0 |
| 0.8506944444444445 | 0 |
| 0.8513888888888889 | 0 |
| 0.8520833333333333 | 0 |
| 0.8527777777777777 | 0 |
| 0.8534722222222223 | 0 |
| 0.8541666666666666 | 0 |
| 0.8548611111111111 | 0 |
| 0.8555555555555556 | 0 |
| 0.8562500000000001 | 0 |
| 0.8569444444444444 | 0 |
| 0.8576388888888888 | 0 |
| 0.8583333333333334 | 0 |
| 0.8590277777777778 | 0 |
| 0.8597222222222222 | 0 |
| 0.8604166666666666 | 0 |
| 0.8611111111111112 | 0 |
| 0.8618055555555556 | 0 |
| 0.8624999999999999 | 0 |
| 0.8631944444444444 | 0 |
| 0.8638888888888889 | 0 |
| 0.8645833333333334 | 0 |
| 0.8652777777777777 | 0 |
| 0.8659722222222223 | 0 |
| 0.8666666666666667 | 0 |
| 0.8673611111111111 | 0 |
| 0.8680555555555555 | 0 |
| 0.86875 | 0 |
| 0.8694444444444445 | 0 |
| 0.8701388888888889 | 0 |
| 0.8708333333333332 | 0 |
| 0.8715277777777778 | 0 |
| 0.8722222222222222 | 0 |
| 0.8729166666666667 | 0 |
| 0.873611111111111 | 0 |
| 0.8743055555555556 | 0 |
| 0.875 | 0 |
| 0.8756944444444444 | 0 |
| 0.876388888888889 | 0 |
| 0.8770833333333333 | 0 |
| 0.8777777777777778 | 0 |
| 0.8784722222222222 | 0 |
| 0.8791666666666668 | 0 |
| 0.8798611111111111 | 0 |
| 0.8805555555555555 | 0 |
| 0.88125 | 0 |
| 0.8819444444444445 | 0 |
| 0.8826388888888889 | 0 |
| 0.8833333333333333 | 0 |
| 0.8840277777777777 | 0 |
| 0.8847222222222223 | 0 |
| 0.8854166666666666 | 0 |
| 0.8861111111111111 | 0 |
| 0.8868055555555556 | 0 |
| 0.8875000000000001 | 0 |
| 0.8881944444444444 | 0 |
| 0.8888888888888888 | 0 |
| 0.8895833333333334 | 0 |
| 0.8902777777777778 | 0 |
| 0.8909722222222222 | 0 |
| 0.8916666666666666 | 0 |
| 0.8923611111111112 | 0 |
| 0.8930555555555556 | 0 |
| 0.8937499999999999 | 0 |
| 0.8944444444444444 | 0 |
| 0.8951388888888889 | 0 |
| 0.8958333333333334 | 0 |
| 0.8965277777777777 | 0 |
| 0.8972222222222223 | 0 |
| 0.8979166666666667 | 0 |
| 0.8986111111111111 | 0 |
| 0.8993055555555555 | 0 |
| 0.9 | 0 |
| 0.9006944444444445 | 0 |
| 0.9013888888888889 | 0 |
| 0.9020833333333332 | 0 |
| 0.9027777777777778 | 0 |
| 0.9034722222222222 | 0 |
| 0.9041666666666667 | 0 |
| 0.904861111111111 | 0 |
| 0.9055555555555556 | 0 |
| 0.90625 | 0 |
| 0.9069444444444444 | 0 |
| 0.907638888888889 | 0 |
| 0.9083333333333333 | 0 |
| 0.9090277777777778 | 0 |
| 0.9097222222222222 | 0 |
| 0.9104166666666668 | 0 |
| 0.9111111111111111 | 0 |
| 0.9118055555555555 | 0 |
| 0.9125 | 0 |
| 0.9131944444444445 | 0 |
| 0.9138888888888889 | 0 |
| 0.9145833333333333 | 0 |
| 0.9152777777777777 | 0 |
| 0.9159722222222223 | 0 |
| 0.9166666666666666 | 0 |
| 0.9173611111111111 | 0 |
| 0.9180555555555556 | 0 |
| 0.9187500000000001 | 0 |
| 0.9194444444444444 | 0 |
| 0.9201388888888888 | 0 |
| 0.9208333333333334 | 0 |
| 0.9215277777777778 | 0 |
| 0.9222222222222222 | 0 |
| 0.9229166666666666 | 0 |
| 0.9236111111111112 | 0 |
| 0.9243055555555556 | 0 |
| 0.9249999999999999 | 0 |
| 0.9256944444444444 | 0 |
| 0.9263888888888889 | 0 |
| 0.9270833333333334 | 0 |
| 0.9277777777777777 | 0 |
| 0.9284722222222223 | 0 |
| 0.9291666666666667 | 0 |
| 0.9298611111111111 | 0 |
| 0.9305555555555555 | 0 |
| 0.93125 | 0 |
| 0.9319444444444445 | 0 |
| 0.9326388888888889 | 0 |
| 0.9333333333333332 | 0 |
| 0.9340277777777778 | 0 |
| 0.9347222222222222 | 0 |
| 0.9354166666666667 | 0 |
| 0.936111111111111 | 0 |
| 0.9368055555555556 | 0 |
| 0.9375 | 0 |
| 0.9381944444444444 | 0 |
| 0.938888888888889 | 0 |
| 0.9395833333333333 | 0 |
| 0.9402777777777778 | 0 |
| 0.9409722222222222 | 0 |
| 0.9416666666666668 | 0 |
| 0.9423611111111111 | 0 |
| 0.9430555555555555 | 0 |
| 0.94375 | 0 |
| 0.9444444444444445 | 0 |
| 0.9451388888888889 | 0 |
| 0.9458333333333333 | 0 |
| 0.9465277777777777 | 0 |
| 0.9472222222222223 | 0 |
| 0.9479166666666666 | 0 |
| 0.9486111111111111 | 0 |
| 0.9493055555555556 | 0 |
| 0.9500000000000001 | 0 |
| 0.9506944444444444 | 0 |
| 0.9513888888888888 | 0 |
| 0.9520833333333334 | 0 |
| 0.9527777777777778 | 0 |
| 0.9534722222222222 | 0 |
| 0.9541666666666666 | 0 |
| 0.9548611111111112 | 0 |
| 0.9555555555555556 | 0 |
| 0.9562499999999999 | 0 |
| 0.9569444444444444 | 0 |
| 0.9576388888888889 | 0 |
| 0.9583333333333334 | 0 |
| 0.9590277777777777 | 0 |
| 0.9597222222222223 | 0 |
| 0.9604166666666667 | 0 |
| 0.9611111111111111 | 0 |
| 0.9618055555555555 | 0 |
| 0.9625 | 0 |
| 0.9631944444444445 | 0 |
| 0.9638888888888889 | 0 |
| 0.9645833333333332 | 0 |
| 0.9652777777777778 | 0 |
| 0.9659722222222222 | 0 |
| 0.9666666666666667 | 0 |
| 0.967361111111111 | 0 |
| 0.9680555555555556 | 0 |
| 0.96875 | 0 |
| 0.9694444444444444 | 0 |
| 0.970138888888889 | 0 |
| 0.9708333333333333 | 0 |
| 0.9715277777777778 | 0 |
| 0.9722222222222222 | 0 |
| 0.9729166666666668 | 0 |
| 0.9736111111111111 | 0 |
| 0.9743055555555555 | 0 |
| 0.975 | 0 |
| 0.9756944444444445 | 0 |
| 0.9763888888888889 | 0 |
| 0.9770833333333333 | 0 |
| 0.9777777777777777 | 0 |
| 0.9784722222222223 | 0 |
| 0.9791666666666666 | 0 |
| 0.9798611111111111 | 0 |
| 0.9805555555555556 | 0 |
| 0.9812500000000001 | 0 |
| 0.9819444444444444 | 0 |
| 0.9826388888888888 | 0 |
| 0.9833333333333334 | 0 |
| 0.9840277777777778 | 0 |
| 0.9847222222222222 | 0 |
| 0.9854166666666666 | 0 |
| 0.9861111111111112 | 0 |
| 0.9868055555555556 | 0 |
| 0.9874999999999999 | 0 |
| 0.9881944444444444 | 0 |
| 0.9888888888888889 | 0 |
| 0.9895833333333334 | 0 |
| 0.9902777777777777 | 0 |
| 0.9909722222222223 | 0 |
| 0.9916666666666667 | 0 |
| 0.9923611111111111 | 0 |
| 0.9930555555555555 | 0 |
| 0.99375 | 0 |
| 0.9944444444444445 | 0 |
| 0.9951388888888889 | 0 |
| 0.9958333333333332 | 0 |
| 0.9965277777777778 | 0 |
| 0.9972222222222222 | 0 |
| 0.9979166666666667 | 0 |
| 0.998611111111111 | 0 |
| 0.9993055555555556 | 0 |